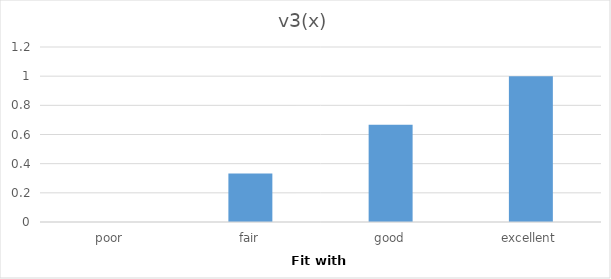
| Category | v3(x) |
|---|---|
| poor | 0 |
| fair | 0.333 |
| good | 0.667 |
| excellent | 1 |